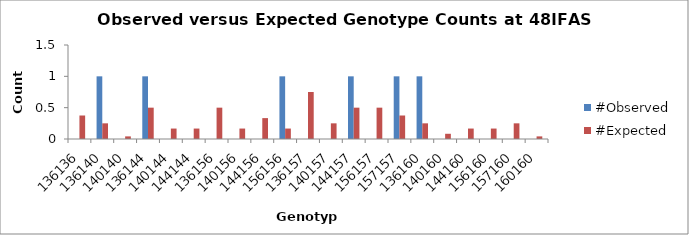
| Category | #Observed | #Expected |
|---|---|---|
| 136136.0 | 0 | 0.375 |
| 136140.0 | 1 | 0.25 |
| 140140.0 | 0 | 0.042 |
| 136144.0 | 1 | 0.5 |
| 140144.0 | 0 | 0.167 |
| 144144.0 | 0 | 0.167 |
| 136156.0 | 0 | 0.5 |
| 140156.0 | 0 | 0.167 |
| 144156.0 | 0 | 0.333 |
| 156156.0 | 1 | 0.167 |
| 136157.0 | 0 | 0.75 |
| 140157.0 | 0 | 0.25 |
| 144157.0 | 1 | 0.5 |
| 156157.0 | 0 | 0.5 |
| 157157.0 | 1 | 0.375 |
| 136160.0 | 1 | 0.25 |
| 140160.0 | 0 | 0.083 |
| 144160.0 | 0 | 0.167 |
| 156160.0 | 0 | 0.167 |
| 157160.0 | 0 | 0.25 |
| 160160.0 | 0 | 0.042 |